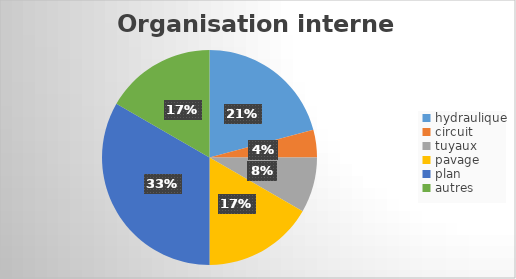
| Category | Series 0 |
|---|---|
| hydraulique | 5 |
| circuit | 1 |
| tuyaux | 2 |
| pavage | 4 |
| plan | 8 |
| autres | 4 |